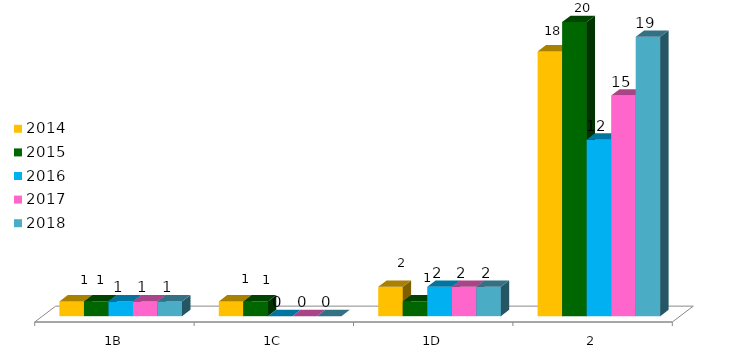
| Category | 2014 | 2015 | 2016 | 2017 | 2018 |
|---|---|---|---|---|---|
| 1B | 1 | 1 | 1 | 1 | 1 |
| 1C | 1 | 1 | 0 | 0 | 0 |
| 1D | 2 | 1 | 2 | 2 | 2 |
| 2 | 18 | 20 | 12 | 15 | 19 |